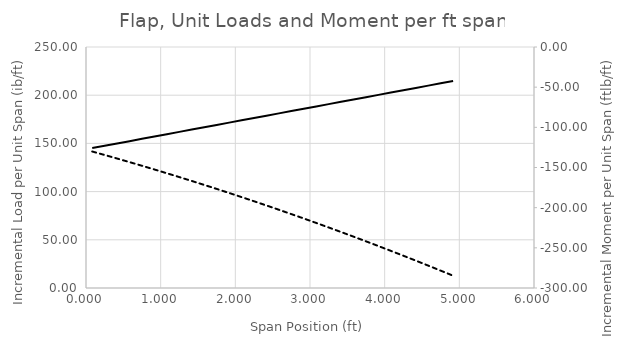
| Category | Series 0 |
|---|---|
| 0.08333333333333333 | 145.145 |
| 0.25 | 147.544 |
| 0.41666666666666663 | 149.943 |
| 0.5833333333333333 | 152.342 |
| 0.75 | 154.741 |
| 0.9166666666666665 | 157.141 |
| 1.0833333333333333 | 159.54 |
| 1.25 | 161.939 |
| 1.4166666666666665 | 164.338 |
| 1.5833333333333335 | 166.737 |
| 1.75 | 169.136 |
| 1.9166666666666667 | 171.535 |
| 2.083333333333333 | 173.934 |
| 2.25 | 176.333 |
| 2.416666666666666 | 178.732 |
| 2.583333333333333 | 181.132 |
| 2.749999999999999 | 183.531 |
| 2.916666666666666 | 185.93 |
| 3.083333333333332 | 188.329 |
| 3.249999999999999 | 190.728 |
| 3.416666666666665 | 193.127 |
| 3.583333333333332 | 195.526 |
| 3.7499999999999982 | 197.925 |
| 3.916666666666665 | 200.324 |
| 4.083333333333332 | 202.723 |
| 4.249999999999998 | 205.122 |
| 4.416666666666666 | 207.522 |
| 4.583333333333332 | 209.921 |
| 4.75 | 212.32 |
| 4.916666666666666 | 214.719 |